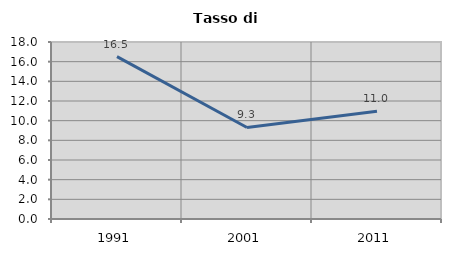
| Category | Tasso di disoccupazione   |
|---|---|
| 1991.0 | 16.513 |
| 2001.0 | 9.308 |
| 2011.0 | 10.957 |